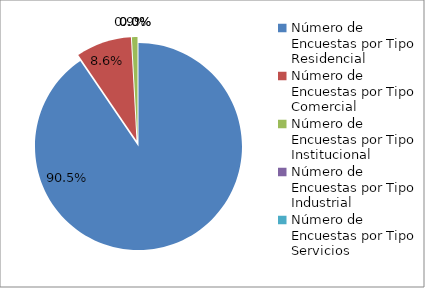
| Category | Series 0 |
|---|---|
| 0 | 314 |
| 1 | 30 |
| 2 | 3 |
| 3 | 0 |
| 4 | 0 |